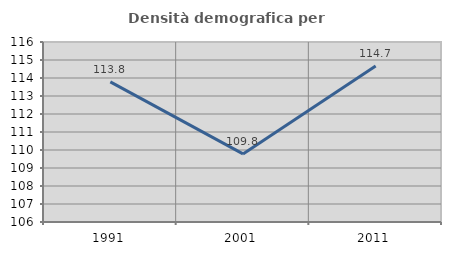
| Category | Densità demografica |
|---|---|
| 1991.0 | 113.782 |
| 2001.0 | 109.783 |
| 2011.0 | 114.662 |